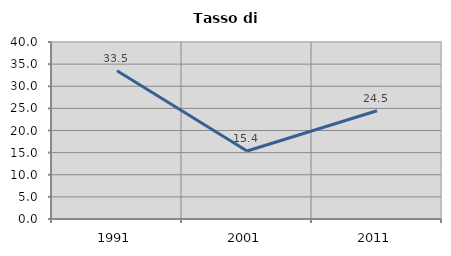
| Category | Tasso di disoccupazione   |
|---|---|
| 1991.0 | 33.494 |
| 2001.0 | 15.38 |
| 2011.0 | 24.454 |